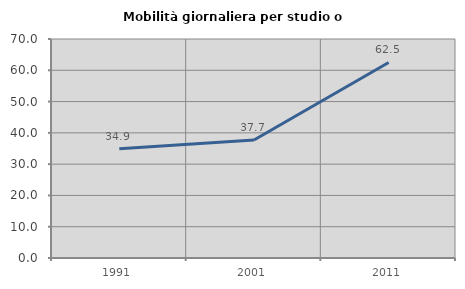
| Category | Mobilità giornaliera per studio o lavoro |
|---|---|
| 1991.0 | 34.884 |
| 2001.0 | 37.725 |
| 2011.0 | 62.5 |